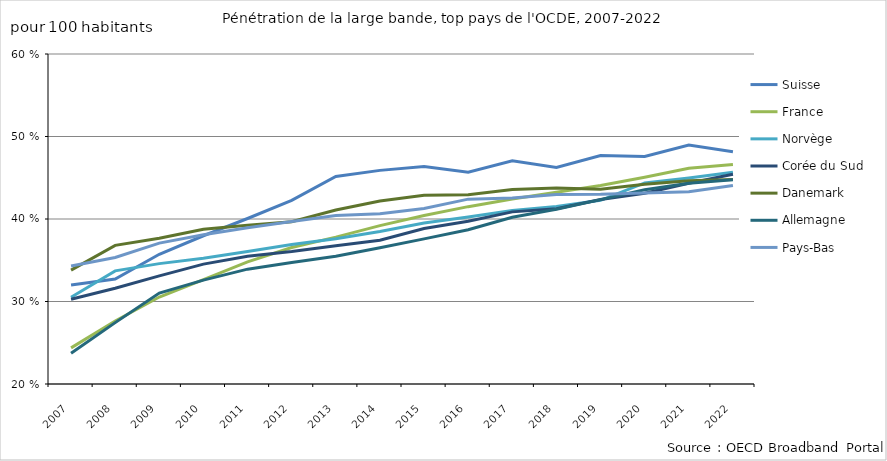
| Category | Suisse | France | Norvège | Corée du Sud | Danemark | Allemagne | Pays-Bas |
|---|---|---|---|---|---|---|---|
| 2007 | 32 | 24.38 | 30.52 | 30.27 | 33.81 | 23.74 | 34.3 |
| 2008 | 32.73 | 27.64 | 33.71 | 31.61 | 36.81 | 27.44 | 35.34 |
| 2009 | 35.72 | 30.54 | 34.59 | 33.1 | 37.67 | 31.03 | 37.08 |
| 2010 | 37.97 | 32.66 | 35.25 | 34.53 | 38.76 | 32.59 | 38.09 |
| 2011 | 40.06 | 34.8 | 36.05 | 35.48 | 39.24 | 33.92 | 38.93 |
| 2012 | 42.25 | 36.54 | 36.92 | 36.05 | 39.67 | 34.73 | 39.71 |
| 2013 | 45.15 | 37.8 | 37.61 | 36.75 | 41.09 | 35.49 | 40.43 |
| 2014 | 45.894 | 39.198 | 38.488 | 37.425 | 42.17 | 36.517 | 40.623 |
| 2015 | 46.363 | 40.415 | 39.508 | 38.847 | 42.875 | 37.592 | 41.269 |
| 2016 | 45.682 | 41.497 | 40.24 | 39.73 | 42.954 | 38.698 | 42.408 |
| 2017 | 47.048 | 42.421 | 41.031 | 40.865 | 43.562 | 40.205 | 42.549 |
| 2018 | 46.24 | 43.24 | 41.53 | 41.25 | 43.76 | 41.19 | 42.98 |
| 2019 | 47.7 | 44.05 | 42.27 | 42.36 | 43.62 | 42.35 | 43 |
| 2020 | 47.58 | 45.05 | 44.37 | 43.12 | 44.22 | 43.55 | 43.14 |
| 2021 | 48.97 | 46.15 | 44.97 | 44.34 | 44.65 | 44.33 | 43.29 |
| 2022 | 48.16 | 46.62 | 45.66 | 45.43 | 44.8 | 44.76 | 44.06 |